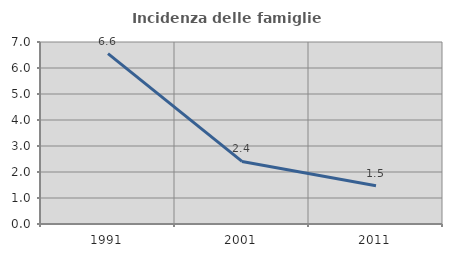
| Category | Incidenza delle famiglie numerose |
|---|---|
| 1991.0 | 6.555 |
| 2001.0 | 2.406 |
| 2011.0 | 1.468 |